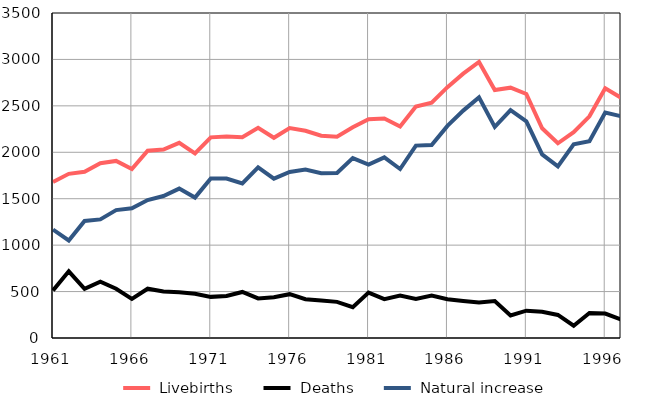
| Category |  Livebirths |  Deaths |  Natural increase |
|---|---|---|---|
| 1961.0 | 1680 | 512 | 1168 |
| 1962.0 | 1768 | 718 | 1050 |
| 1963.0 | 1791 | 530 | 1261 |
| 1964.0 | 1883 | 606 | 1277 |
| 1965.0 | 1907 | 530 | 1377 |
| 1966.0 | 1819 | 422 | 1397 |
| 1967.0 | 2017 | 531 | 1486 |
| 1968.0 | 2029 | 500 | 1529 |
| 1969.0 | 2102 | 493 | 1609 |
| 1970.0 | 1989 | 477 | 1512 |
| 1971.0 | 2161 | 443 | 1718 |
| 1972.0 | 2170 | 453 | 1717 |
| 1973.0 | 2161 | 496 | 1665 |
| 1974.0 | 2263 | 426 | 1837 |
| 1975.0 | 2156 | 440 | 1716 |
| 1976.0 | 2260 | 472 | 1788 |
| 1977.0 | 2232 | 418 | 1814 |
| 1978.0 | 2179 | 404 | 1775 |
| 1979.0 | 2167 | 389 | 1778 |
| 1980.0 | 2269 | 332 | 1937 |
| 1981.0 | 2356 | 489 | 1867 |
| 1982.0 | 2364 | 419 | 1945 |
| 1983.0 | 2278 | 458 | 1820 |
| 1984.0 | 2492 | 420 | 2072 |
| 1985.0 | 2535 | 456 | 2079 |
| 1986.0 | 2701 | 417 | 2284 |
| 1987.0 | 2847 | 398 | 2449 |
| 1988.0 | 2973 | 382 | 2591 |
| 1989.0 | 2671 | 398 | 2273 |
| 1990.0 | 2696 | 243 | 2453 |
| 1991.0 | 2628 | 294 | 2334 |
| 1992.0 | 2259 | 282 | 1977 |
| 1993.0 | 2097 | 248 | 1849 |
| 1994.0 | 2217 | 132 | 2085 |
| 1995.0 | 2387 | 269 | 2118 |
| 1996.0 | 2690 | 263 | 2427 |
| 1997.0 | 2588 | 200 | 2388 |